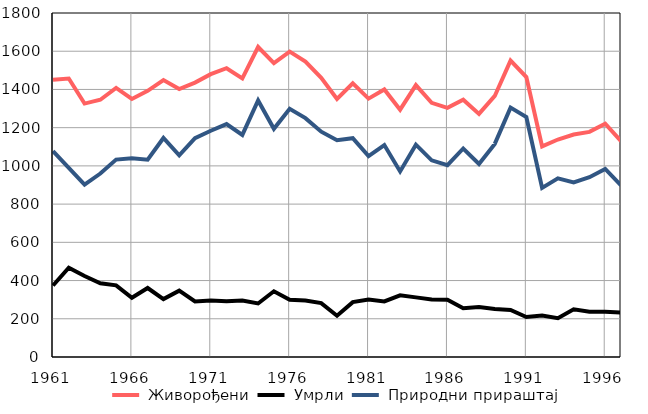
| Category |  Живорођени |  Умрли |  Природни прираштај |
|---|---|---|---|
| 1961.0 | 1451 | 374 | 1077 |
| 1962.0 | 1457 | 467 | 990 |
| 1963.0 | 1326 | 424 | 902 |
| 1964.0 | 1346 | 386 | 960 |
| 1965.0 | 1408 | 375 | 1033 |
| 1966.0 | 1350 | 310 | 1040 |
| 1967.0 | 1393 | 361 | 1032 |
| 1968.0 | 1449 | 303 | 1146 |
| 1969.0 | 1402 | 347 | 1055 |
| 1970.0 | 1436 | 291 | 1145 |
| 1971.0 | 1480 | 296 | 1184 |
| 1972.0 | 1511 | 292 | 1219 |
| 1973.0 | 1458 | 296 | 1162 |
| 1974.0 | 1622 | 280 | 1342 |
| 1975.0 | 1538 | 344 | 1194 |
| 1976.0 | 1598 | 299 | 1299 |
| 1977.0 | 1546 | 296 | 1250 |
| 1978.0 | 1461 | 282 | 1179 |
| 1979.0 | 1350 | 216 | 1134 |
| 1980.0 | 1432 | 287 | 1145 |
| 1981.0 | 1352 | 301 | 1051 |
| 1982.0 | 1400 | 291 | 1109 |
| 1983.0 | 1294 | 323 | 971 |
| 1984.0 | 1423 | 312 | 1111 |
| 1985.0 | 1330 | 301 | 1029 |
| 1986.0 | 1304 | 300 | 1004 |
| 1987.0 | 1346 | 255 | 1091 |
| 1988.0 | 1272 | 262 | 1010 |
| 1989.0 | 1366 | 251 | 1115 |
| 1990.0 | 1551 | 246 | 1305 |
| 1991.0 | 1465 | 209 | 1256 |
| 1992.0 | 1102 | 217 | 885 |
| 1993.0 | 1138 | 203 | 935 |
| 1994.0 | 1164 | 250 | 914 |
| 1995.0 | 1178 | 237 | 941 |
| 1996.0 | 1221 | 237 | 984 |
| 1997.0 | 1130 | 232 | 898 |